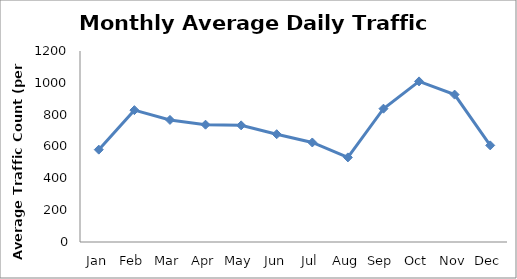
| Category | Series 0 |
|---|---|
| Jan | 580.25 |
| Feb | 828.5 |
| Mar | 767 |
| Apr | 737 |
| May | 732.75 |
| Jun | 677.25 |
| Jul | 625.25 |
| Aug | 531.5 |
| Sep | 837.5 |
| Oct | 1009 |
| Nov | 926 |
| Dec | 607 |